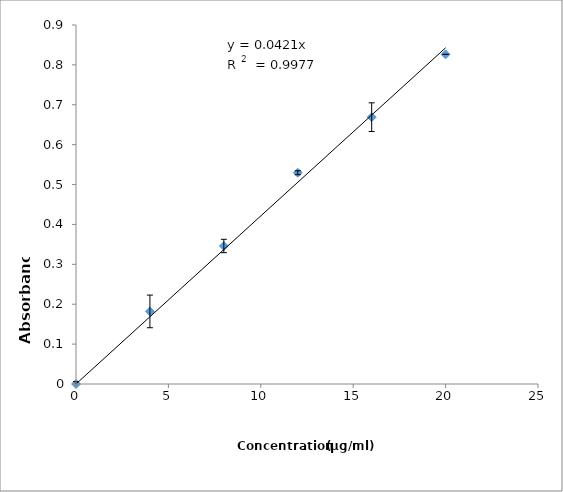
| Category | Series 0 |
|---|---|
| 0.0 | 0 |
| 4.0 | 0.182 |
| 8.0 | 0.346 |
| 12.0 | 0.53 |
| 16.0 | 0.669 |
| 20.0 | 0.826 |